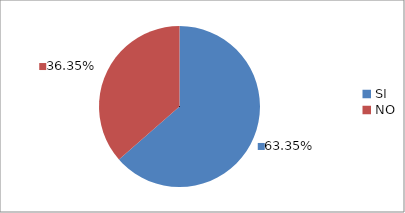
| Category | Series 0 |
|---|---|
| SI | 0.634 |
| NO | 0.364 |